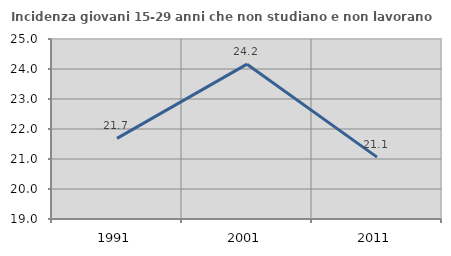
| Category | Incidenza giovani 15-29 anni che non studiano e non lavorano  |
|---|---|
| 1991.0 | 21.687 |
| 2001.0 | 24.161 |
| 2011.0 | 21.062 |